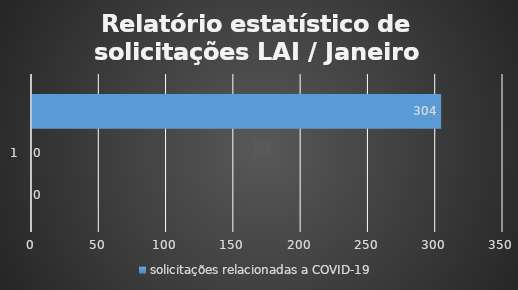
| Category | solicitações relacionadas a COVID-19 | solicitações em aberto | total de solicitações |
|---|---|---|---|
| 0 | 0 | 0 | 304 |